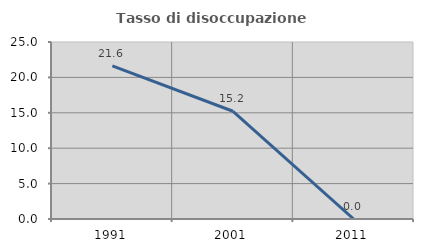
| Category | Tasso di disoccupazione giovanile  |
|---|---|
| 1991.0 | 21.622 |
| 2001.0 | 15.217 |
| 2011.0 | 0 |